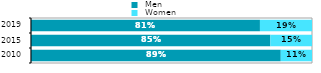
| Category |  Men |  Women |
|---|---|---|
| 2010.0 | 0.889 | 0.111 |
| 2015.0 | 0.852 | 0.148 |
| 2019.0 | 0.815 | 0.185 |